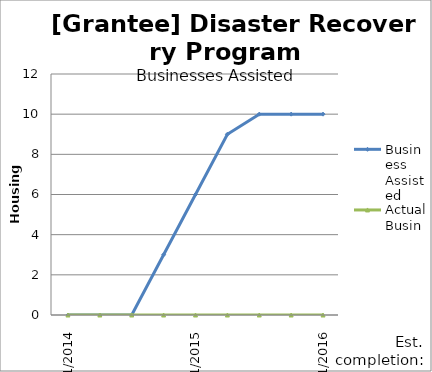
| Category | Business Assisted | Actual Businesses |
|---|---|---|
| 1/2014 | 0 | 0 |
| 4/2014 | 0 | 0 |
| 7/2014 | 0 | 0 |
| 10/2014 | 3 | 0 |
| 1/2015 | 6 | 0 |
| 4/2015 | 9 | 0 |
| 7/2015 | 10 | 0 |
| 10/2015 | 10 | 0 |
| 1/2016 | 10 | 0 |